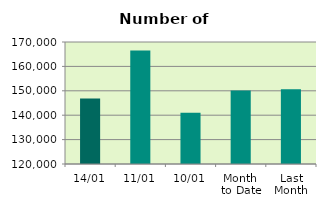
| Category | Series 0 |
|---|---|
| 14/01 | 146842 |
| 11/01 | 166552 |
| 10/01 | 140968 |
| Month 
to Date | 150119.778 |
| Last
Month | 150628.737 |